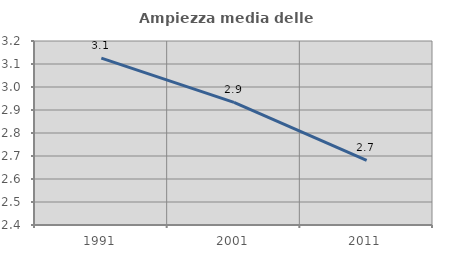
| Category | Ampiezza media delle famiglie |
|---|---|
| 1991.0 | 3.125 |
| 2001.0 | 2.933 |
| 2011.0 | 2.681 |